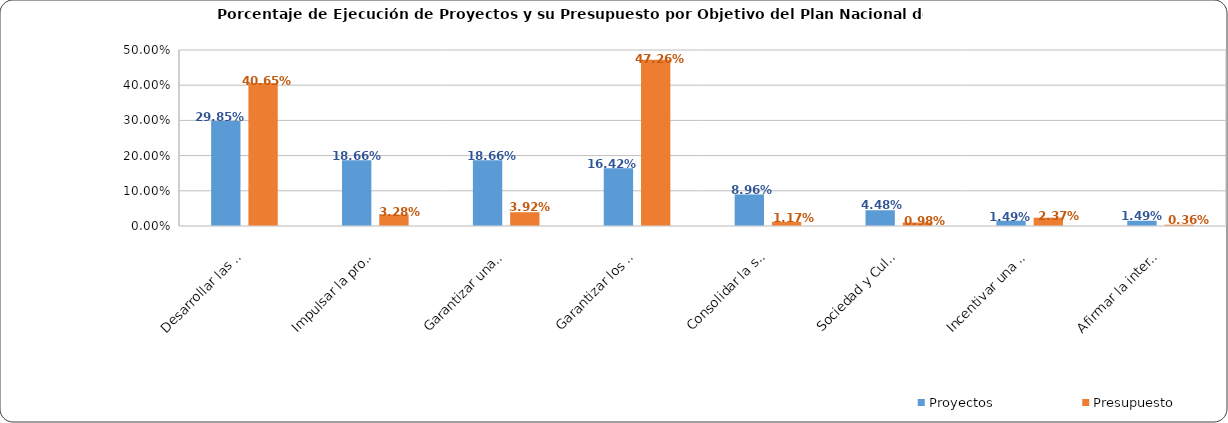
| Category | Proyectos | Presupuesto |
|---|---|---|
| Desarrollar las capacidades productivas | 0.299 | 0.407 |
| Impulsar la productividad y competitividad | 0.187 | 0.033 |
| Garantizar una vida digna con iguales oportunidad | 0.187 | 0.039 |
| Garantizar los derechos de la naturaleza | 0.164 | 0.473 |
| Consolidar la sostenibilidad del sistema económico | 0.09 | 0.012 |
| Sociedad y Cultura | 0.045 | 0.01 |
| Incentivar una sociedad participativa | 0.015 | 0.024 |
| Afirmar la interculturalidad y plurinacionalidad,  | 0.015 | 0.004 |